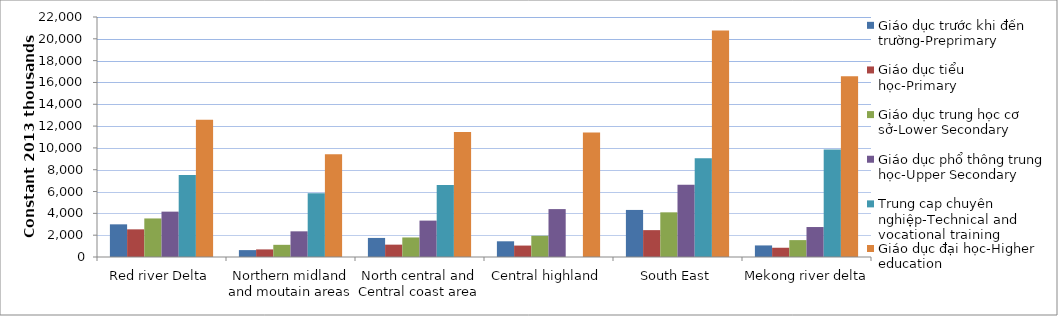
| Category | Giáo dục trước khi đến trường-Preprimary  | Giáo dục tiểu học-Primary  | Giáo dục trung học cơ sở-Lower Secondary | Giáo dục phổ thông trung học-Upper Secondary | Trung cap chuyên nghiệp-Technical and vocational training | Giáo dục đại học-Higher education |
|---|---|---|---|---|---|---|
| Red river Delta | 2994.238 | 2535.226 | 3533.918 | 4157.993 | 7510.972 | 12571.68 |
| Northern midland and moutain areas | 631.405 | 695.996 | 1116.209 | 2352.866 | 5846.197 | 9421.779 |
| North central and Central coast area | 1747.13 | 1132.037 | 1791.328 | 3336.351 | 6593.527 | 11454.2 |
| Central highland | 1439.434 | 1048.054 | 1949.689 | 4390.716 | 0 | 11417 |
| South East | 4314.407 | 2463.061 | 4095.154 | 6612.389 | 9043.152 | 20759.73 |
| Mekong river delta | 1060.808 | 848.658 | 1548.321 | 2747.188 | 9865.022 | 16569.82 |